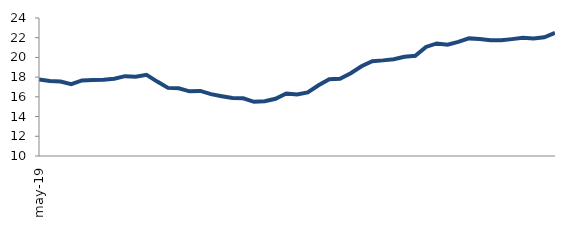
| Category | Series 0 |
|---|---|
| 2019-05-01 | 17.752 |
| 2019-06-01 | 17.602 |
| 2019-07-01 | 17.56 |
| 2019-08-01 | 17.291 |
| 2019-09-01 | 17.666 |
| 2019-10-01 | 17.704 |
| 2019-11-01 | 17.747 |
| 2019-12-01 | 17.844 |
| 2020-01-01 | 18.099 |
| 2020-02-01 | 18.039 |
| 2020-03-01 | 18.244 |
| 2020-04-01 | 17.551 |
| 2020-05-01 | 16.911 |
| 2020-06-01 | 16.867 |
| 2020-07-01 | 16.563 |
| 2020-08-01 | 16.602 |
| 2020-09-01 | 16.272 |
| 2020-10-01 | 16.069 |
| 2020-11-01 | 15.889 |
| 2020-12-01 | 15.855 |
| 2021-01-01 | 15.501 |
| 2021-02-01 | 15.555 |
| 2021-03-01 | 15.803 |
| 2021-04-01 | 16.335 |
| 2021-05-01 | 16.232 |
| 2021-06-01 | 16.452 |
| 2021-07-01 | 17.177 |
| 2021-08-01 | 17.778 |
| 2021-09-01 | 17.842 |
| 2021-10-01 | 18.396 |
| 2021-11-01 | 19.101 |
| 2021-12-01 | 19.622 |
| 2022-01-01 | 19.702 |
| 2022-02-01 | 19.825 |
| 2022-03-01 | 20.061 |
| 2022-04-01 | 20.163 |
| 2022-05-01 | 21.067 |
| 2022-06-01 | 21.42 |
| 2022-07-01 | 21.282 |
| 2022-08-01 | 21.579 |
| 2022-09-01 | 21.932 |
| 2022-10-01 | 21.875 |
| 2022-11-01 | 21.741 |
| 2022-12-01 | 21.732 |
| 2023-01-01 | 21.858 |
| 2023-02-01 | 21.995 |
| 2023-03-01 | 21.919 |
| 2023-04-01 | 22.045 |
| 2023-05-01 | 22.483 |